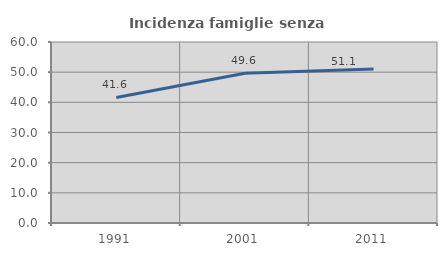
| Category | Incidenza famiglie senza nuclei |
|---|---|
| 1991.0 | 41.611 |
| 2001.0 | 49.63 |
| 2011.0 | 51.064 |